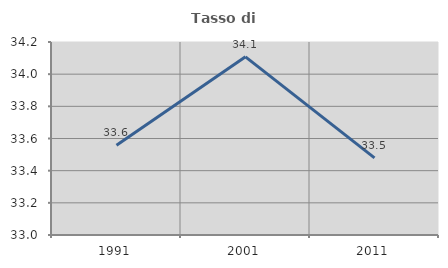
| Category | Tasso di occupazione   |
|---|---|
| 1991.0 | 33.558 |
| 2001.0 | 34.108 |
| 2011.0 | 33.48 |